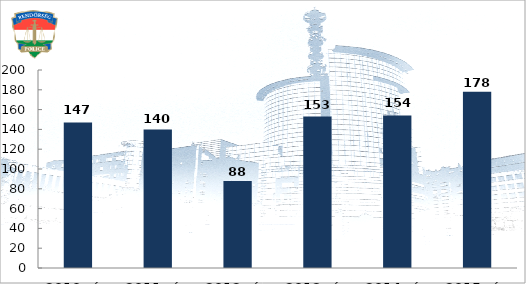
| Category | Büntető feljelentések száma |
|---|---|
| 2010. év | 147 |
| 2011. év | 140 |
| 2012. év | 88 |
| 2013. év | 153 |
| 2014. év | 154 |
| 2015. év | 178 |